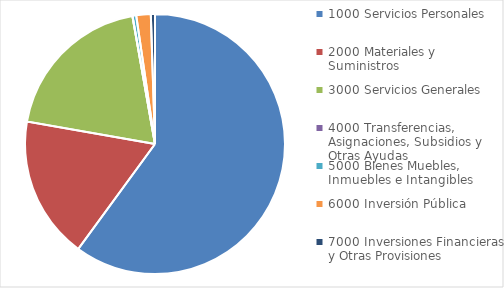
| Category |             Asignado  |
|---|---|
| 1000 Servicios Personales | 8016945230.3 |
| 2000 Materiales y Suministros | 2365428647.29 |
| 3000 Servicios Generales | 2597641544.79 |
| 4000 Transferencias, Asignaciones, Subsidios y Otras Ayudas | 1393689.09 |
| 5000 Bienes Muebles, Inmuebles e Intangibles | 61568584 |
| 6000 Inversión Pública | 240000000 |
| 7000 Inversiones Financieras y Otras Provisiones | 68706854.98 |